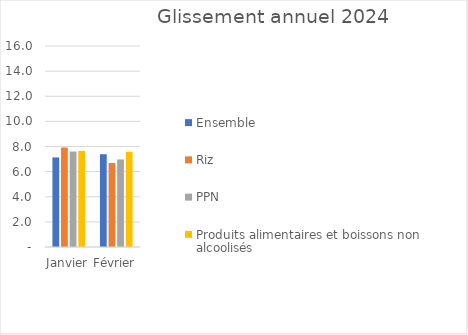
| Category |  Ensemble  |  Riz  |  PPN  |  Produits alimentaires et boissons non alcoolisés  |
|---|---|---|---|---|
| Janvier | 7.132 | 7.916 | 7.6 | 7.649 |
| Février | 7.385 | 6.679 | 6.969 | 7.582 |